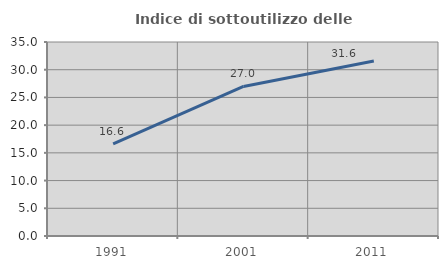
| Category | Indice di sottoutilizzo delle abitazioni  |
|---|---|
| 1991.0 | 16.6 |
| 2001.0 | 26.976 |
| 2011.0 | 31.573 |